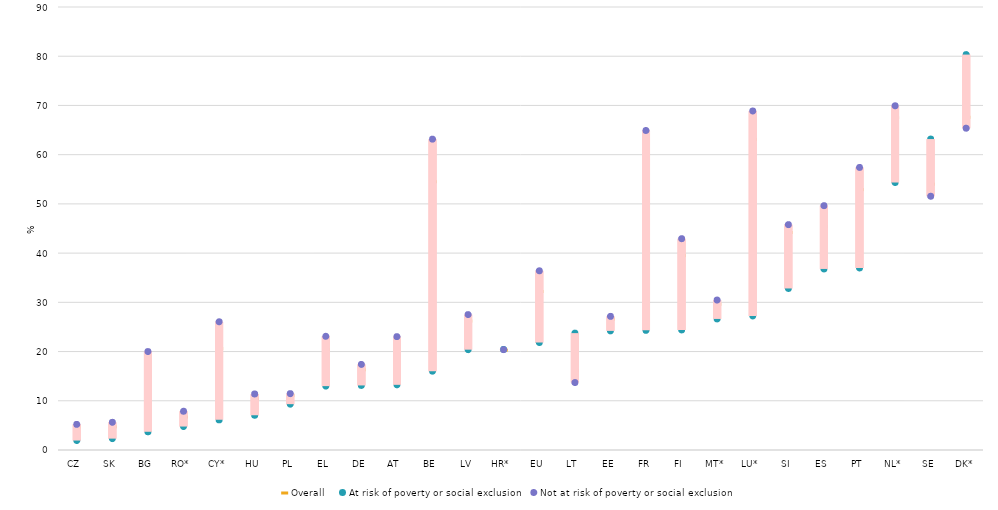
| Category | Overall  | At risk of poverty or social exclusion  | Not at risk of poverty or social exclusion |
|---|---|---|---|
| CZ | 4.8 | 1.92 | 5.209 |
| SK | 4.8 | 2.31 | 5.624 |
| BG | 15 | 3.703 | 19.997 |
| RO* | 6.8 | 4.763 | 7.875 |
| CY* | 20.7 | 6.12 | 26.048 |
| HU | 10.5 | 7.063 | 11.385 |
| PL | 11.2 | 9.313 | 11.444 |
| EL | 20.5 | 12.977 | 23.104 |
| DE | 16.4 | 13.115 | 17.386 |
| AT | 21.1 | 13.24 | 23.03 |
| BE | 54.6 | 16.017 | 63.152 |
| LV | 26.3 | 20.382 | 27.509 |
| HR* | 20.4 | 20.435 | 20.388 |
| EU | 32.3 | 21.837 | 36.406 |
| LT | 16.2 | 23.746 | 13.705 |
| EE | 26.7 | 24.196 | 27.15 |
| FR | 57.2 | 24.31 | 64.914 |
| FI | 39.6 | 24.394 | 42.932 |
| MT* | 29.7 | 26.626 | 30.468 |
| LU* | 63.2 | 27.233 | 68.865 |
| SI | 44.3 | 32.819 | 45.785 |
| ES | 45.5 | 36.782 | 49.639 |
| PT | 53 | 36.984 | 57.407 |
| NL* | 67.6 | 54.343 | 69.933 |
| SE | 54.1 | 63.172 | 51.553 |
| DK* | 67.7 | 80.333 | 65.375 |